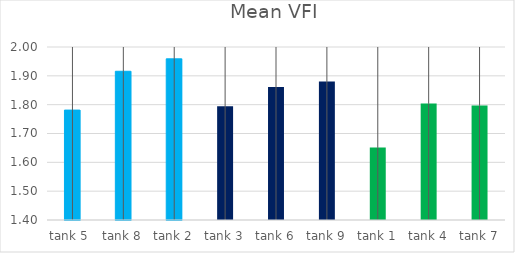
| Category | mean VFI |
|---|---|
| tank 5  | 1.781 |
| tank 8 | 1.916 |
| tank 2 | 1.959 |
| tank 3 | 1.794 |
| tank 6 | 1.861 |
| tank 9 | 1.881 |
| tank 1 | 1.651 |
| tank 4 | 1.804 |
| tank 7 | 1.797 |